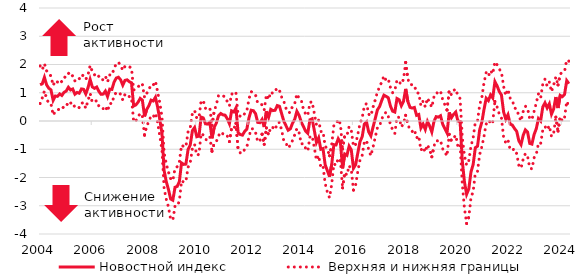
| Category | Новостной индекс | Верхняя и нижняя границы | Series 2 |
|---|---|---|---|
| 2004-02-01 | 1.283 | 0.618 | 1.949 |
| 2004-03-01 | 1.317 | 0.817 | 1.816 |
| 2004-04-01 | 1.545 | 1.064 | 2.026 |
| 2004-05-01 | 1.279 | 0.781 | 1.776 |
| 2004-06-01 | 1.16 | 0.636 | 1.684 |
| 2004-07-01 | 1.101 | 0.61 | 1.592 |
| 2004-08-01 | 0.733 | 0.209 | 1.257 |
| 2004-09-01 | 0.884 | 0.342 | 1.426 |
| 2004-10-01 | 0.873 | 0.366 | 1.379 |
| 2004-11-01 | 0.957 | 0.451 | 1.463 |
| 2004-12-01 | 0.904 | 0.424 | 1.384 |
| 2005-01-01 | 1.014 | 0.518 | 1.51 |
| 2005-02-01 | 1.06 | 0.507 | 1.613 |
| 2005-03-01 | 1.194 | 0.686 | 1.702 |
| 2005-04-01 | 1.098 | 0.631 | 1.566 |
| 2005-05-01 | 1.133 | 0.658 | 1.608 |
| 2005-06-01 | 0.949 | 0.481 | 1.418 |
| 2005-07-01 | 1.011 | 0.511 | 1.511 |
| 2005-08-01 | 0.983 | 0.472 | 1.494 |
| 2005-09-01 | 1.135 | 0.628 | 1.642 |
| 2005-10-01 | 1.121 | 0.648 | 1.595 |
| 2005-11-01 | 0.96 | 0.446 | 1.473 |
| 2005-12-01 | 1.172 | 0.721 | 1.624 |
| 2006-01-01 | 1.47 | 0.975 | 1.965 |
| 2006-02-01 | 1.207 | 0.662 | 1.752 |
| 2006-03-01 | 1.156 | 0.678 | 1.635 |
| 2006-04-01 | 1.203 | 0.721 | 1.685 |
| 2006-05-01 | 1.052 | 0.529 | 1.575 |
| 2006-06-01 | 0.945 | 0.436 | 1.454 |
| 2006-07-01 | 0.952 | 0.438 | 1.465 |
| 2006-08-01 | 1.058 | 0.527 | 1.588 |
| 2006-09-01 | 0.866 | 0.347 | 1.385 |
| 2006-10-01 | 1.128 | 0.626 | 1.63 |
| 2006-11-01 | 1.118 | 0.611 | 1.625 |
| 2006-12-01 | 1.378 | 0.899 | 1.856 |
| 2007-01-01 | 1.519 | 1.012 | 2.026 |
| 2007-02-01 | 1.549 | 1.017 | 2.08 |
| 2007-03-01 | 1.459 | 0.948 | 1.97 |
| 2007-04-01 | 1.269 | 0.745 | 1.793 |
| 2007-05-01 | 1.438 | 0.94 | 1.935 |
| 2007-06-01 | 1.458 | 0.958 | 1.958 |
| 2007-07-01 | 1.391 | 0.86 | 1.922 |
| 2007-08-01 | 1.351 | 0.829 | 1.872 |
| 2007-09-01 | 0.532 | -0.033 | 1.097 |
| 2007-10-01 | 0.569 | 0.007 | 1.131 |
| 2007-11-01 | 0.664 | 0.137 | 1.191 |
| 2007-12-01 | 0.8 | 0.274 | 1.325 |
| 2008-01-01 | 0.739 | 0.173 | 1.304 |
| 2008-02-01 | 0.164 | -0.503 | 0.831 |
| 2008-03-01 | 0.408 | -0.164 | 0.979 |
| 2008-04-01 | 0.542 | -0.024 | 1.109 |
| 2008-05-01 | 0.738 | 0.189 | 1.288 |
| 2008-06-01 | 0.709 | 0.145 | 1.273 |
| 2008-07-01 | 0.84 | 0.276 | 1.404 |
| 2008-08-01 | 0.494 | -0.049 | 1.037 |
| 2008-09-01 | 0.056 | -0.531 | 0.644 |
| 2008-10-01 | -0.435 | -1.02 | 0.151 |
| 2008-11-01 | -1.76 | -2.388 | -1.133 |
| 2008-12-01 | -2.15 | -2.776 | -1.523 |
| 2009-01-01 | -2.427 | -3.045 | -1.808 |
| 2009-02-01 | -2.762 | -3.486 | -2.039 |
| 2009-03-01 | -2.804 | -3.496 | -2.112 |
| 2009-04-01 | -2.346 | -3.014 | -1.677 |
| 2009-05-01 | -2.316 | -3.013 | -1.618 |
| 2009-06-01 | -2.144 | -2.828 | -1.459 |
| 2009-07-01 | -1.483 | -2.114 | -0.852 |
| 2009-08-01 | -1.537 | -2.166 | -0.908 |
| 2009-09-01 | -1.527 | -2.141 | -0.912 |
| 2009-10-01 | -1.01 | -1.636 | -0.383 |
| 2009-11-01 | -0.85 | -1.47 | -0.229 |
| 2009-12-01 | -0.341 | -0.966 | 0.284 |
| 2010-01-01 | -0.23 | -0.83 | 0.369 |
| 2010-02-01 | -0.556 | -1.213 | 0.101 |
| 2010-03-01 | -0.535 | -1.178 | 0.108 |
| 2010-04-01 | 0.139 | -0.437 | 0.714 |
| 2010-05-01 | 0.108 | -0.501 | 0.716 |
| 2010-06-01 | -0.1 | -0.651 | 0.451 |
| 2010-07-01 | -0.109 | -0.68 | 0.462 |
| 2010-08-01 | -0.045 | -0.562 | 0.472 |
| 2010-09-01 | -0.613 | -1.073 | -0.153 |
| 2010-10-01 | -0.225 | -0.792 | 0.341 |
| 2010-11-01 | -0.073 | -0.724 | 0.579 |
| 2010-12-01 | 0.19 | -0.525 | 0.904 |
| 2011-01-01 | 0.267 | -0.391 | 0.925 |
| 2011-02-01 | 0.218 | -0.454 | 0.89 |
| 2011-03-01 | 0.207 | -0.442 | 0.857 |
| 2011-04-01 | 0.083 | -0.525 | 0.691 |
| 2011-05-01 | -0.096 | -0.729 | 0.538 |
| 2011-06-01 | 0.357 | -0.25 | 0.964 |
| 2011-07-01 | 0.318 | -0.284 | 0.921 |
| 2011-08-01 | 0.46 | -0.085 | 1.005 |
| 2011-09-01 | -0.414 | -1.028 | 0.199 |
| 2011-10-01 | -0.479 | -1.129 | 0.17 |
| 2011-11-01 | -0.501 | -1.146 | 0.145 |
| 2011-12-01 | -0.369 | -1.001 | 0.262 |
| 2012-01-01 | -0.288 | -0.926 | 0.349 |
| 2012-02-01 | 0.117 | -0.553 | 0.787 |
| 2012-03-01 | 0.381 | -0.277 | 1.039 |
| 2012-04-01 | 0.365 | -0.276 | 1.007 |
| 2012-05-01 | 0.261 | -0.403 | 0.924 |
| 2012-06-01 | -0.05 | -0.736 | 0.636 |
| 2012-07-01 | -0.059 | -0.707 | 0.589 |
| 2012-08-01 | 0.055 | -0.468 | 0.577 |
| 2012-09-01 | -0.215 | -0.826 | 0.397 |
| 2012-10-01 | 0.343 | -0.245 | 0.931 |
| 2012-11-01 | 0.132 | -0.496 | 0.76 |
| 2012-12-01 | 0.412 | -0.207 | 1.031 |
| 2013-01-01 | 0.368 | -0.235 | 0.97 |
| 2013-02-01 | 0.381 | -0.309 | 1.071 |
| 2013-03-01 | 0.546 | -0.072 | 1.164 |
| 2013-04-01 | 0.52 | -0.048 | 1.087 |
| 2013-05-01 | 0.258 | -0.327 | 0.843 |
| 2013-06-01 | -0.006 | -0.71 | 0.699 |
| 2013-07-01 | -0.168 | -0.783 | 0.448 |
| 2013-08-01 | -0.326 | -0.956 | 0.305 |
| 2013-09-01 | -0.277 | -0.853 | 0.299 |
| 2013-10-01 | -0.077 | -0.688 | 0.533 |
| 2013-11-01 | 0.06 | -0.49 | 0.609 |
| 2013-12-01 | 0.344 | -0.269 | 0.957 |
| 2014-01-01 | 0.201 | -0.405 | 0.807 |
| 2014-02-01 | -0.034 | -0.811 | 0.743 |
| 2014-03-01 | -0.19 | -0.799 | 0.418 |
| 2014-04-01 | -0.36 | -0.965 | 0.246 |
| 2014-05-01 | -0.436 | -1.062 | 0.191 |
| 2014-06-01 | 0.044 | -0.567 | 0.656 |
| 2014-07-01 | 0.079 | -0.525 | 0.683 |
| 2014-08-01 | -0.33 | -0.929 | 0.269 |
| 2014-09-01 | -0.761 | -1.382 | -0.14 |
| 2014-10-01 | -0.595 | -1.222 | 0.032 |
| 2014-11-01 | -1.001 | -1.63 | -0.373 |
| 2014-12-01 | -0.974 | -1.582 | -0.367 |
| 2015-01-01 | -1.551 | -2.209 | -0.894 |
| 2015-02-01 | -1.756 | -2.523 | -0.989 |
| 2015-03-01 | -1.972 | -2.714 | -1.23 |
| 2015-04-01 | -1.538 | -2.24 | -0.836 |
| 2015-05-01 | -0.836 | -1.516 | -0.156 |
| 2015-06-01 | -0.846 | -1.568 | -0.124 |
| 2015-07-01 | -0.629 | -1.314 | 0.056 |
| 2015-08-01 | -0.762 | -1.419 | -0.104 |
| 2015-09-01 | -1.678 | -2.366 | -0.99 |
| 2015-10-01 | -1.168 | -1.817 | -0.518 |
| 2015-11-01 | -1.215 | -1.913 | -0.517 |
| 2015-12-01 | -0.89 | -1.578 | -0.201 |
| 2016-01-01 | -1.023 | -1.719 | -0.326 |
| 2016-02-01 | -1.672 | -2.445 | -0.899 |
| 2016-03-01 | -1.545 | -2.262 | -0.828 |
| 2016-04-01 | -1.129 | -1.786 | -0.471 |
| 2016-05-01 | -0.731 | -1.378 | -0.084 |
| 2016-06-01 | -0.558 | -1.22 | 0.104 |
| 2016-07-01 | -0.109 | -0.749 | 0.532 |
| 2016-08-01 | -0.033 | -0.687 | 0.62 |
| 2016-09-01 | -0.388 | -1.015 | 0.239 |
| 2016-10-01 | -0.526 | -1.231 | 0.18 |
| 2016-11-01 | -0.216 | -0.923 | 0.491 |
| 2016-12-01 | 0.083 | -0.581 | 0.746 |
| 2017-01-01 | 0.393 | -0.242 | 1.028 |
| 2017-02-01 | 0.511 | -0.186 | 1.208 |
| 2017-03-01 | 0.73 | 0.073 | 1.387 |
| 2017-04-01 | 0.914 | 0.232 | 1.596 |
| 2017-05-01 | 0.873 | 0.313 | 1.434 |
| 2017-06-01 | 0.822 | 0.164 | 1.481 |
| 2017-07-01 | 0.527 | -0.125 | 1.178 |
| 2017-08-01 | 0.347 | -0.31 | 1.004 |
| 2017-09-01 | 0.316 | -0.442 | 1.074 |
| 2017-10-01 | 0.795 | 0.14 | 1.451 |
| 2017-11-01 | 0.753 | 0.126 | 1.381 |
| 2017-12-01 | 0.543 | -0.214 | 1.299 |
| 2018-01-01 | 0.699 | -0.083 | 1.481 |
| 2018-02-01 | 1.137 | 0.2 | 2.074 |
| 2018-03-01 | 0.686 | -0.112 | 1.483 |
| 2018-04-01 | 0.481 | -0.33 | 1.292 |
| 2018-05-01 | 0.458 | -0.369 | 1.285 |
| 2018-06-01 | 0.479 | -0.302 | 1.261 |
| 2018-07-01 | 0.202 | -0.599 | 1.002 |
| 2018-08-01 | 0.23 | -0.523 | 0.984 |
| 2018-09-01 | -0.248 | -1.037 | 0.542 |
| 2018-10-01 | -0.109 | -0.927 | 0.709 |
| 2018-11-01 | -0.299 | -1.098 | 0.5 |
| 2018-12-01 | -0.015 | -0.839 | 0.81 |
| 2019-01-01 | -0.177 | -1.008 | 0.654 |
| 2019-02-01 | -0.39 | -1.268 | 0.487 |
| 2019-03-01 | -0.017 | -0.886 | 0.853 |
| 2019-04-01 | 0.154 | -0.694 | 1.003 |
| 2019-05-01 | 0.137 | -0.709 | 0.984 |
| 2019-06-01 | 0.186 | -0.687 | 1.058 |
| 2019-07-01 | -0.112 | -0.984 | 0.759 |
| 2019-08-01 | -0.267 | -1.102 | 0.569 |
| 2019-09-01 | -0.426 | -1.24 | 0.389 |
| 2019-10-01 | 0.304 | -0.473 | 1.081 |
| 2019-11-01 | 0.114 | -0.701 | 0.928 |
| 2019-12-01 | 0.234 | -0.607 | 1.076 |
| 2020-01-01 | 0.315 | -0.504 | 1.133 |
| 2020-02-01 | -0.005 | -0.904 | 0.894 |
| 2020-03-01 | -0.014 | -0.822 | 0.794 |
| 2020-04-01 | -1.4 | -2.219 | -0.581 |
| 2020-05-01 | -2.159 | -3.089 | -1.23 |
| 2020-06-01 | -2.593 | -3.627 | -1.559 |
| 2020-07-01 | -2.404 | -3.408 | -1.401 |
| 2020-08-01 | -1.803 | -2.716 | -0.889 |
| 2020-09-01 | -1.539 | -2.487 | -0.591 |
| 2020-10-01 | -0.944 | -1.843 | -0.045 |
| 2020-11-01 | -0.892 | -1.782 | -0.003 |
| 2020-12-01 | -0.306 | -1.182 | 0.57 |
| 2021-01-01 | -0.037 | -0.912 | 0.837 |
| 2021-02-01 | 0.416 | -0.534 | 1.365 |
| 2021-03-01 | 0.806 | -0.102 | 1.714 |
| 2021-04-01 | 0.722 | -0.144 | 1.588 |
| 2021-05-01 | 0.922 | 0.057 | 1.787 |
| 2021-06-01 | 0.816 | -0.032 | 1.665 |
| 2021-07-01 | 1.392 | 0.691 | 2.093 |
| 2021-08-01 | 1.244 | 0.495 | 1.992 |
| 2021-09-01 | 1.044 | 0.25 | 1.837 |
| 2021-10-01 | 0.922 | 0.115 | 1.73 |
| 2021-11-01 | 0.318 | -0.586 | 1.222 |
| 2021-12-01 | 0.062 | -0.778 | 0.901 |
| 2022-01-01 | 0.223 | -0.675 | 1.122 |
| 2022-02-01 | -0.107 | -1.02 | 0.806 |
| 2022-03-01 | -0.144 | -1.027 | 0.738 |
| 2022-04-01 | -0.266 | -0.99 | 0.459 |
| 2022-05-01 | -0.365 | -1.158 | 0.428 |
| 2022-06-01 | -0.702 | -1.575 | 0.17 |
| 2022-07-01 | -0.834 | -1.668 | 0 |
| 2022-08-01 | -0.506 | -1.349 | 0.337 |
| 2022-09-01 | -0.314 | -1.152 | 0.523 |
| 2022-10-01 | -0.391 | -1.241 | 0.458 |
| 2022-11-01 | -0.794 | -1.662 | 0.074 |
| 2022-12-01 | -0.818 | -1.694 | 0.058 |
| 2023-01-01 | -0.48 | -1.302 | 0.342 |
| 2023-02-01 | -0.274 | -1.187 | 0.64 |
| 2023-03-01 | 0.084 | -0.79 | 0.958 |
| 2023-04-01 | 0.001 | -0.807 | 0.81 |
| 2023-05-01 | 0.497 | -0.312 | 1.306 |
| 2023-06-01 | 0.641 | -0.196 | 1.478 |
| 2023-07-01 | 0.463 | -0.312 | 1.238 |
| 2023-08-01 | 0.608 | -0.166 | 1.383 |
| 2023-09-01 | 0.243 | -0.55 | 1.036 |
| 2023-10-01 | 0.426 | -0.424 | 1.276 |
| 2023-11-01 | 0.848 | 0.137 | 1.56 |
| 2023-12-01 | 0.46 | -0.357 | 1.277 |
| 2024-01-01 | 0.906 | 0.151 | 1.662 |
| 2024-02-01 | 0.862 | -0.004 | 1.728 |
| 2024-03-01 | 0.944 | 0.123 | 1.765 |
| 2024-04-01 | 1.428 | 0.696 | 2.161 |
| 2024-05-01 | 1.319 | 0.52 | 2.119 |